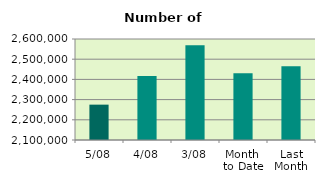
| Category | Series 0 |
|---|---|
| 5/08 | 2275016 |
| 4/08 | 2416248 |
| 3/08 | 2569150 |
| Month 
to Date | 2430614 |
| Last
Month | 2465054.636 |